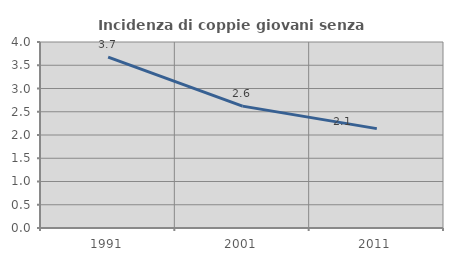
| Category | Incidenza di coppie giovani senza figli |
|---|---|
| 1991.0 | 3.673 |
| 2001.0 | 2.621 |
| 2011.0 | 2.137 |